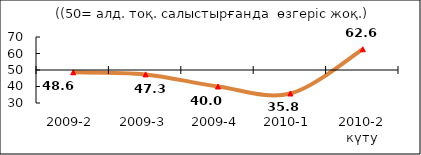
| Category | Диф.индекс ↓ |
|---|---|
| 2009-2 | 48.62 |
| 2009-3 | 47.335 |
| 2009-4 | 40.005 |
| 2010-1 | 35.765 |
| 2010-2 күту | 62.59 |